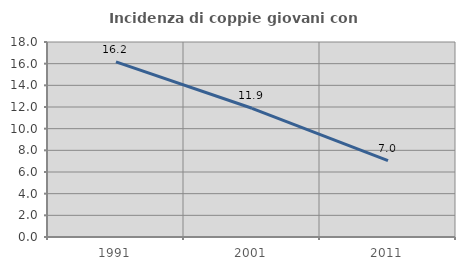
| Category | Incidenza di coppie giovani con figli |
|---|---|
| 1991.0 | 16.167 |
| 2001.0 | 11.881 |
| 2011.0 | 7.045 |